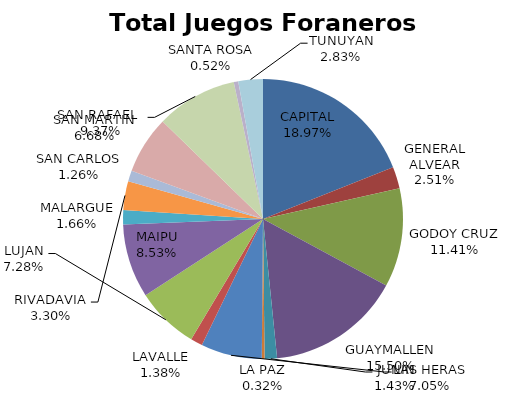
| Category | Total Juegos Foraneros Recaudación  |
|---|---|
| CAPITAL | 5854890 |
| GENERAL ALVEAR | 773949 |
| GODOY CRUZ | 3523233 |
| GUAYMALLEN | 4785635 |
| JUNIN | 441275 |
| LA PAZ | 98655 |
| LAS HERAS | 2177256 |
| LAVALLE | 425527 |
| LUJAN | 2246265 |
| MAIPU | 2633715 |
| MALARGUE | 511888 |
| RIVADAVIA | 1018732 |
| SAN CARLOS | 389991 |
| SAN MARTIN | 2061245 |
| SAN RAFAEL  | 2891829 |
| SANTA ROSA | 161254 |
| TUNUYAN | 874161 |